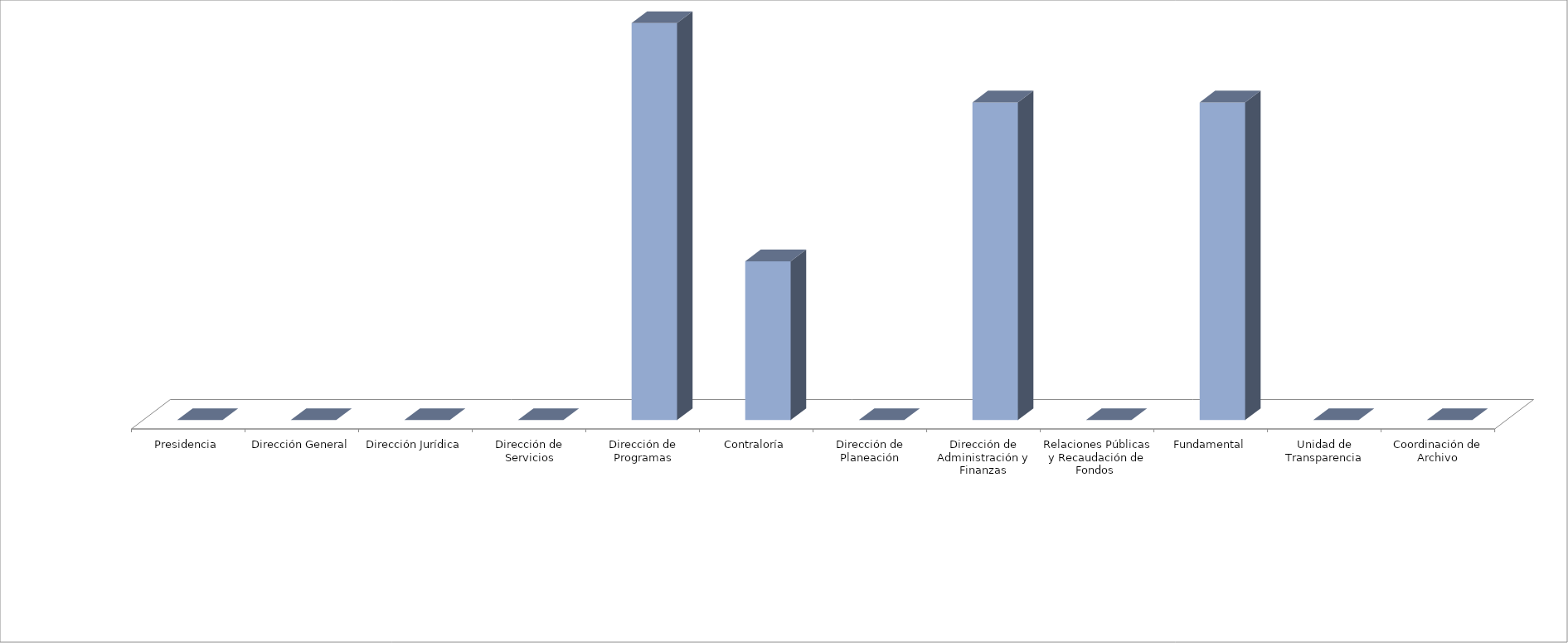
| Category | Series 0 | Series 1 |
|---|---|---|
| Presidencia |  | 0 |
| Dirección General |  | 0 |
| Dirección Jurídica |  | 0 |
| Dirección de Servicios |  | 0 |
| Dirección de Programas |  | 5 |
| Contraloría |  | 2 |
| Dirección de Planeación |  | 0 |
| Dirección de Administración y Finanzas |  | 4 |
| Relaciones Públicas y Recaudación de Fondos  |  | 0 |
| Fundamental |  | 4 |
| Unidad de Transparencia |  | 0 |
| Coordinación de Archivo |  | 0 |